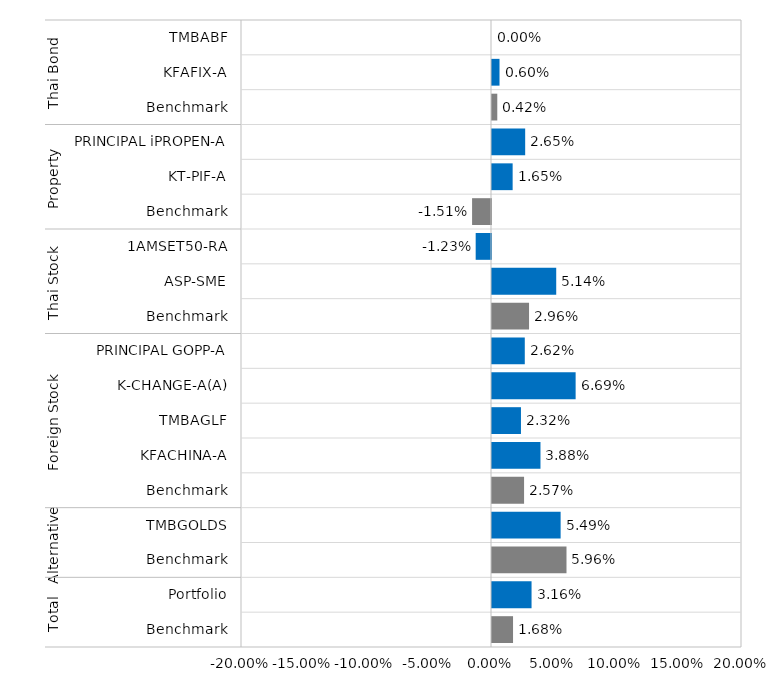
| Category | Series 0 |
|---|---|
| 0 | 0 |
| 1 | 0.006 |
| 2 | 0.004 |
| 3 | 0.027 |
| 4 | 0.017 |
| 5 | -0.015 |
| 6 | -0.012 |
| 7 | 0.051 |
| 8 | 0.03 |
| 9 | 0.026 |
| 10 | 0.067 |
| 11 | 0.023 |
| 12 | 0.039 |
| 13 | 0.026 |
| 14 | 0.055 |
| 15 | 0.06 |
| 16 | 0.032 |
| 17 | 0.017 |